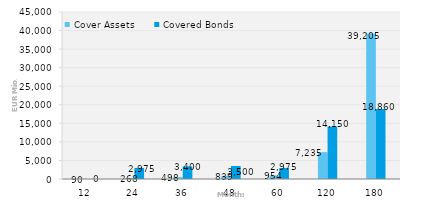
| Category | Cover Assets | Covered Bonds |
|---|---|---|
| 12.0 | 90.048 | 0 |
| 24.0 | 268.427 | 2975 |
| 36.0 | 498.479 | 3400 |
| 48.0 | 838.659 | 3500 |
| 60.0 | 954.499 | 2975 |
| 120.0 | 7235.174 | 14150 |
| 180.0 | 39205.364 | 18860 |